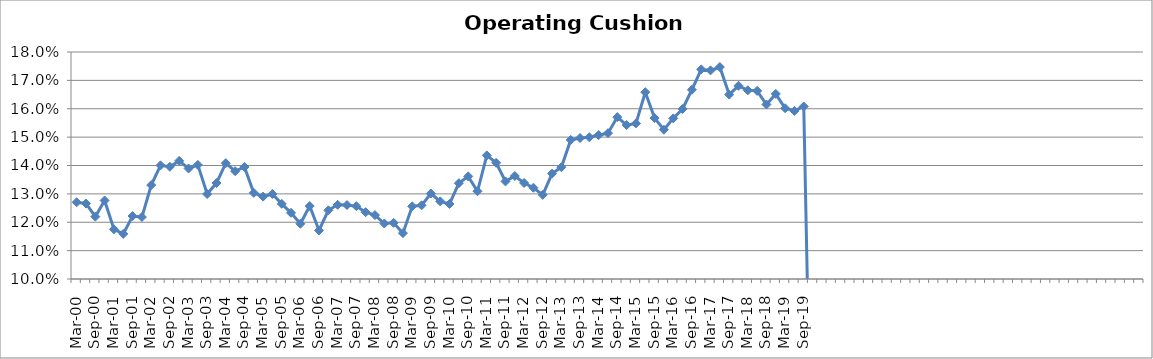
| Category | Operating Cushion % |
|---|---|
| Mar-00 | 0.127 |
| Jun-00 | 0.127 |
| Sep-00 | 0.122 |
| Dec-00 | 0.128 |
| Mar-01 | 0.118 |
| Jun-01 | 0.116 |
| Sep-01 | 0.122 |
| Dec-01 | 0.122 |
| Mar-02 | 0.133 |
| Jun-02 | 0.14 |
| Sep-02 | 0.14 |
| Dec-02 | 0.142 |
| Mar-03 | 0.139 |
| Jun-03 | 0.14 |
| Sep-03 | 0.13 |
| Dec-03 | 0.134 |
| Mar-04 | 0.141 |
| Jun-04 | 0.138 |
| Sep-04 | 0.139 |
| Dec-04 | 0.13 |
| Mar-05 | 0.129 |
| Jun-05 | 0.13 |
| Sep-05 | 0.126 |
| Dec-05 | 0.123 |
| Mar-06 | 0.119 |
| Jun-06 | 0.126 |
| Sep-06 | 0.117 |
| Dec-06 | 0.124 |
| Mar-07 | 0.126 |
| Jun-07 | 0.126 |
| Sep-07 | 0.126 |
| Dec-07 | 0.124 |
| Mar-08 | 0.123 |
| Jun-08 | 0.12 |
| Sep-08 | 0.12 |
| Dec-08 | 0.116 |
| Mar-09 | 0.126 |
| Jun-09 | 0.126 |
| Sep-09 | 0.13 |
| Dec-09 | 0.127 |
| Mar-10 | 0.126 |
| Jun-10 | 0.134 |
| Sep-10 | 0.136 |
| Dec-10 | 0.131 |
| Mar-11 | 0.144 |
| Jun-11 | 0.141 |
| Sep-11 | 0.134 |
| Dec-11 | 0.136 |
| Mar-12 | 0.134 |
| Jun-12 | 0.132 |
| Sep-12 | 0.13 |
| Dec-12 | 0.137 |
| Mar-13 | 0.139 |
| Jun-13 | 0.149 |
| Sep-13 | 0.15 |
| Dec-13 | 0.15 |
| Mar-14 | 0.151 |
| Jun-14 | 0.151 |
| Sep-14 | 0.157 |
| Dec-14 | 0.154 |
| Mar-15 | 0.155 |
| Jun-15 | 0.166 |
| Sep-15 | 0.157 |
| Dec-15 | 0.153 |
| Mar-16 | 0.157 |
| Jun-16 | 0.16 |
| Sep-16 | 0.167 |
| Dec-16 | 0.174 |
| Mar-17 | 0.174 |
| Jun-17 | 0.175 |
| Sep-17 | 0.165 |
| Dec-17 | 0.168 |
| Mar-18 | 0.167 |
| Jun-18 | 0.166 |
| Sep-18 | 0.161 |
| Dec-18 | 0.165 |
| Mar-19 | 0.16 |
| Jun-19 | 0.159 |
| Sep-19 | 0.161 |